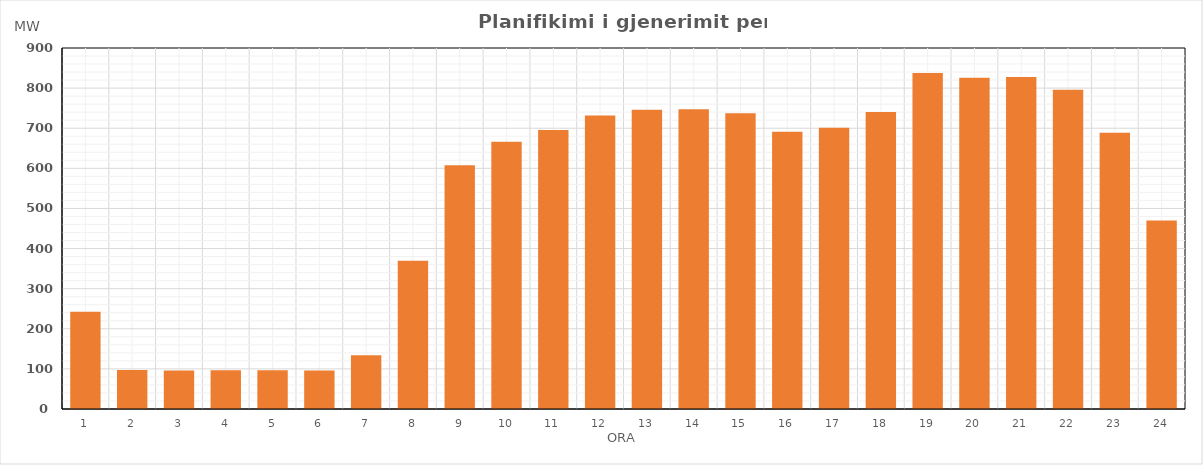
| Category | Max (MW) |
|---|---|
| 0 | 242.246 |
| 1 | 96.922 |
| 2 | 95.87 |
| 3 | 96.761 |
| 4 | 96.515 |
| 5 | 96.202 |
| 6 | 133.739 |
| 7 | 369.608 |
| 8 | 607.519 |
| 9 | 666.262 |
| 10 | 695.286 |
| 11 | 731.945 |
| 12 | 745.921 |
| 13 | 747.506 |
| 14 | 737.057 |
| 15 | 691.42 |
| 16 | 701.279 |
| 17 | 740.146 |
| 18 | 837.855 |
| 19 | 825.725 |
| 20 | 827.98 |
| 21 | 795.96 |
| 22 | 688.856 |
| 23 | 469.649 |